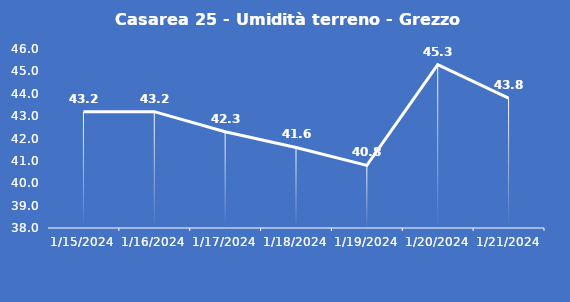
| Category | Casarea 25 - Umidità terreno - Grezzo (%VWC) |
|---|---|
| 1/15/24 | 43.2 |
| 1/16/24 | 43.2 |
| 1/17/24 | 42.3 |
| 1/18/24 | 41.6 |
| 1/19/24 | 40.8 |
| 1/20/24 | 45.3 |
| 1/21/24 | 43.8 |